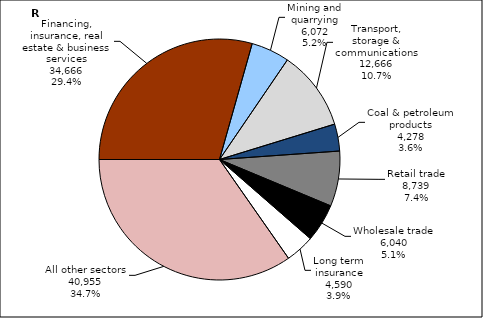
| Category | Series 3 |
|---|---|
| Financing, insurance, real estate & business services | 34666.028 |
| Mining and quarrying | 6072.027 |
| Transport, storage & communications | 12665.836 |
| Coal & petroleum products | 4277.849 |
| Retail trade | 8739.301 |
| Wholesale trade | 6039.523 |
| Long term insurance | 4589.928 |
| All other sectors | 40955.127 |